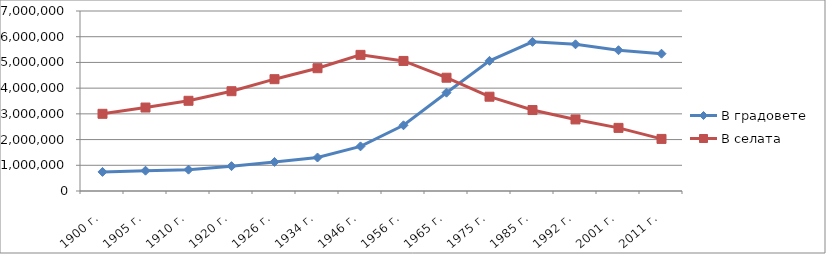
| Category | В градовете | В селата |
|---|---|---|
| 1900 г. | 742435 | 3001848 |
| 1905 г. | 789689 | 3245886 |
| 1910 г. | 829522 | 3507991 |
| 1920 г. | 966375 | 3880596 |
| 1926 г. | 1130131 | 4348610 |
| 1934 г. | 1302551 | 4775388 |
| 1946 г. | 1735188 | 5294161 |
| 1956 г. | 2556071 | 5057638 |
| 1965 г. | 3822824 | 4405042 |
| 1975 г. | 5061087 | 3666684 |
| 1985 г. | 5799939 | 3148710 |
| 1992 г. | 5704552 | 2782765 |
| 2001 г. | 5474534 | 2454367 |
| 2011 г. | 5339001 | 2025569 |